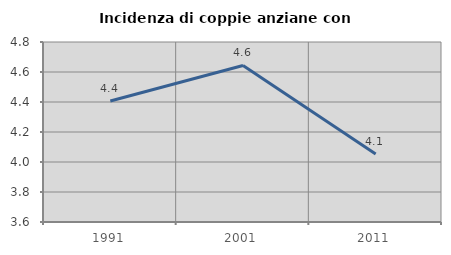
| Category | Incidenza di coppie anziane con figli |
|---|---|
| 1991.0 | 4.407 |
| 2001.0 | 4.643 |
| 2011.0 | 4.054 |